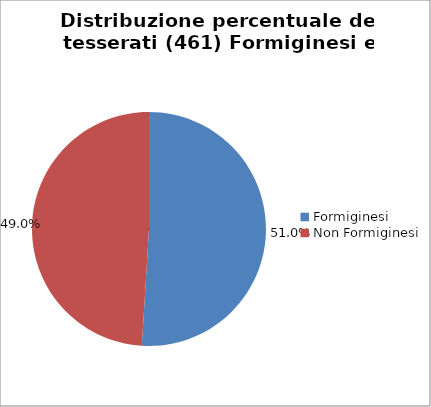
| Category | Nr. Tesserati |
|---|---|
| Formiginesi | 235 |
| Non Formiginesi | 226 |